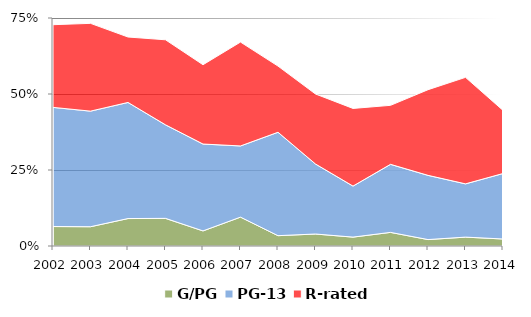
| Category | G/PG | PG-13 | R-rated |
|---|---|---|---|
| 2002.0 | 0.064 | 0.392 | 0.272 |
| 2003.0 | 0.063 | 0.38 | 0.289 |
| 2004.0 | 0.09 | 0.382 | 0.215 |
| 2005.0 | 0.091 | 0.308 | 0.28 |
| 2006.0 | 0.05 | 0.286 | 0.261 |
| 2007.0 | 0.095 | 0.234 | 0.342 |
| 2008.0 | 0.034 | 0.34 | 0.218 |
| 2009.0 | 0.039 | 0.23 | 0.23 |
| 2010.0 | 0.029 | 0.168 | 0.255 |
| 2011.0 | 0.045 | 0.224 | 0.194 |
| 2012.0 | 0.021 | 0.211 | 0.282 |
| 2013.0 | 0.029 | 0.175 | 0.35 |
| 2014.0 | 0.023 | 0.215 | 0.208 |